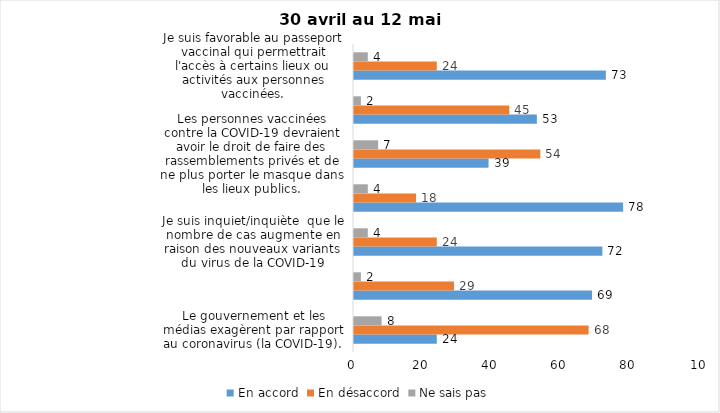
| Category | En accord | En désaccord | Ne sais pas |
|---|---|---|---|
| Le gouvernement et les médias exagèrent par rapport au coronavirus (la COVID-19). | 24 | 68 | 8 |
| Je suis favorable au maintien du couvre-feu pour les prochaines semaines. | 69 | 29 | 2 |
| Je suis inquiet/inquiète  que le nombre de cas augmente en raison des nouveaux variants du virus de la COVID-19 | 72 | 24 | 4 |
| La frontière entre le Canada et les États-Unis devrait être fermée au moins jusqu’en septembre 2021 | 78 | 18 | 4 |
| Les personnes vaccinées contre la COVID-19 devraient avoir le droit de faire des rassemblements privés et de ne plus porter le masque dans les lieux publics. | 39 | 54 | 7 |
| Je suis favorable au port du masque à l'extérieur en tout temps lorsqu'on est avec des personnes avec qui l'on n'habite pas. | 53 | 45 | 2 |
| Je suis favorable au passeport vaccinal qui permettrait l'accès à certains lieux ou activités aux personnes vaccinées. | 73 | 24 | 4 |